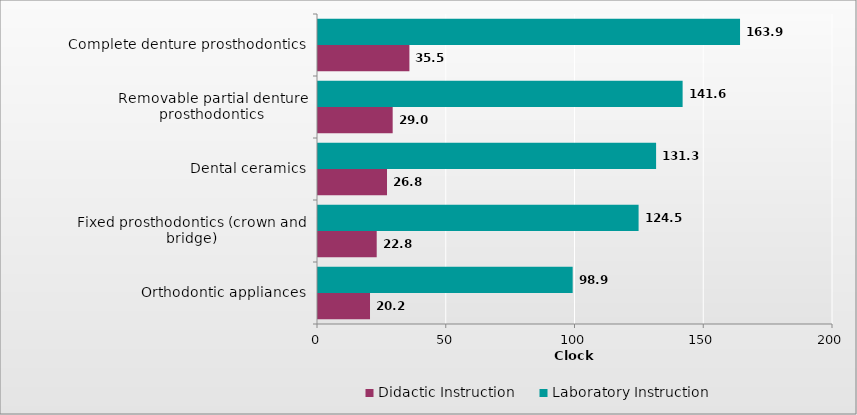
| Category | Didactic Instruction | Laboratory Instruction |
|---|---|---|
| Orthodontic appliances | 20.2 | 98.9 |
| Fixed prosthodontics (crown and bridge) | 22.8 | 124.5 |
| Dental ceramics | 26.8 | 131.3 |
| Removable partial denture prosthodontics | 29 | 141.6 |
| Complete denture prosthodontics | 35.5 | 163.9 |